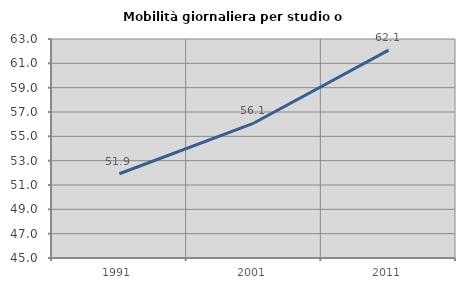
| Category | Mobilità giornaliera per studio o lavoro |
|---|---|
| 1991.0 | 51.923 |
| 2001.0 | 56.093 |
| 2011.0 | 62.085 |